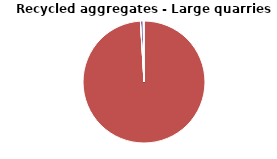
| Category | Series 0 |
|---|---|
| DRILLING AND BLASTING | 0 |
| MATERIAL PROCESSING | 28.502 |
| INTERNAL TRANSPORT | 0 |
| MATERIAL HANDLING OPERATION | 0.211 |
| WIND EROSION FROM STOCKPILES | 0.061 |